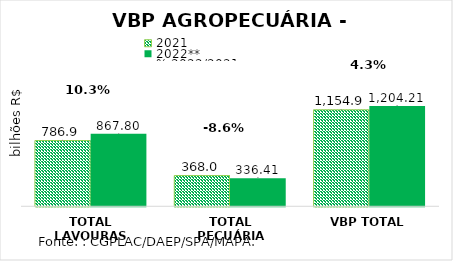
| Category | 2021 | 2022** |
|---|---|---|
| TOTAL LAVOURAS | 786.943 | 867.8 |
| TOTAL PECUÁRIA | 367.967 | 336.41 |
| VBP TOTAL | 1154.91 | 1204.21 |